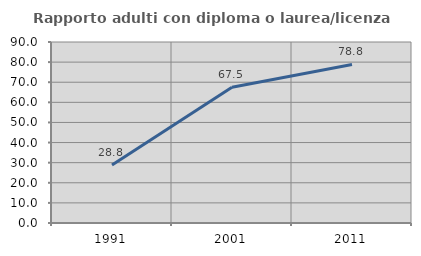
| Category | Rapporto adulti con diploma o laurea/licenza media  |
|---|---|
| 1991.0 | 28.81 |
| 2001.0 | 67.545 |
| 2011.0 | 78.843 |